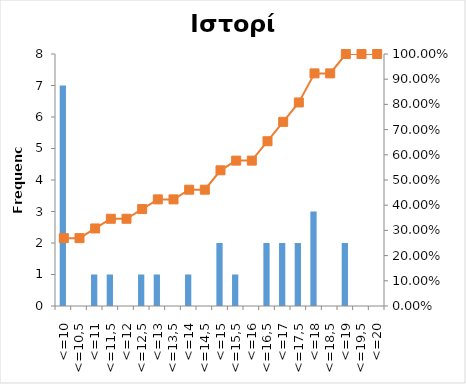
| Category | Series 0 |
|---|---|
| <=10 | 7 |
| <=10,5 | 0 |
| <=11 | 1 |
| <=11,5 | 1 |
| <=12 | 0 |
| <=12,5 | 1 |
| <=13 | 1 |
| <=13,5 | 0 |
| <=14 | 1 |
| <=14,5 | 0 |
| <=15 | 2 |
| <=15,5 | 1 |
| <=16 | 0 |
| <=16,5 | 2 |
| <=17 | 2 |
| <=17,5 | 2 |
| <=18 | 3 |
| <=18,5 | 0 |
| <=19 | 2 |
| <=19,5 | 0 |
| <=20 | 0 |